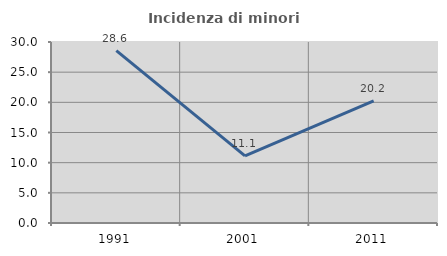
| Category | Incidenza di minori stranieri |
|---|---|
| 1991.0 | 28.571 |
| 2001.0 | 11.111 |
| 2011.0 | 20.238 |